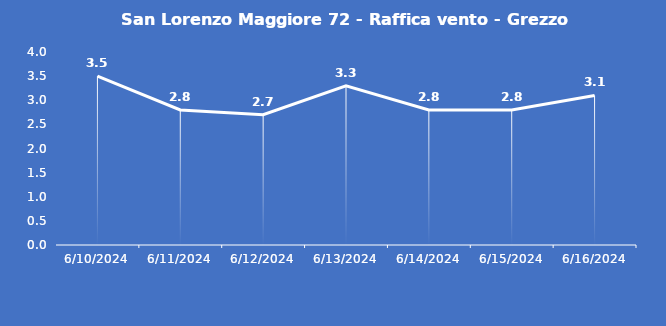
| Category | San Lorenzo Maggiore 72 - Raffica vento - Grezzo (m/s) |
|---|---|
| 6/10/24 | 3.5 |
| 6/11/24 | 2.8 |
| 6/12/24 | 2.7 |
| 6/13/24 | 3.3 |
| 6/14/24 | 2.8 |
| 6/15/24 | 2.8 |
| 6/16/24 | 3.1 |